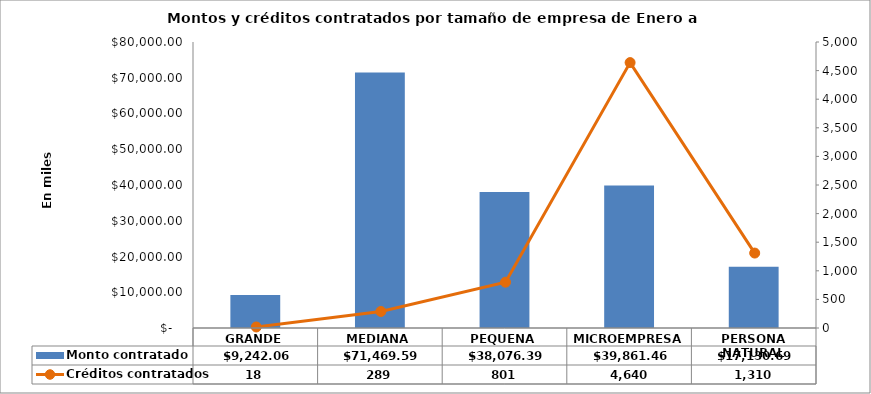
| Category | Monto contratado |
|---|---|
| GRANDE | 9242.064 |
| MEDIANA | 71469.593 |
| PEQUENA | 38076.393 |
| MICROEMPRESA | 39861.462 |
| PERSONA NATURAL | 17130.688 |